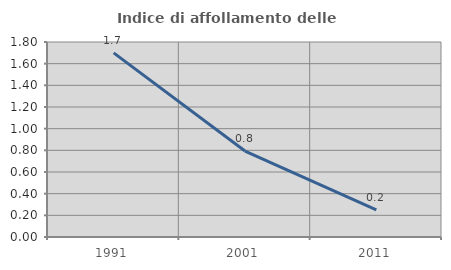
| Category | Indice di affollamento delle abitazioni  |
|---|---|
| 1991.0 | 1.7 |
| 2001.0 | 0.794 |
| 2011.0 | 0.249 |